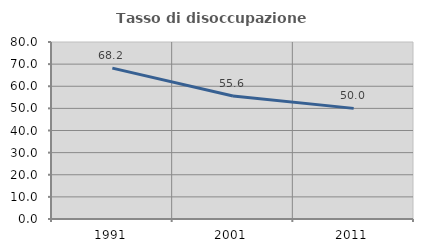
| Category | Tasso di disoccupazione giovanile  |
|---|---|
| 1991.0 | 68.182 |
| 2001.0 | 55.556 |
| 2011.0 | 50 |